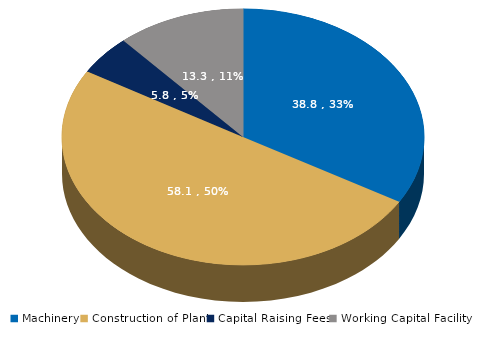
| Category | Series 0 |
|---|---|
| Machinery | 38.813 |
| Construction of Plant | 58.08 |
| Capital Raising Fees | 5.808 |
| Working Capital Facility | 13.299 |